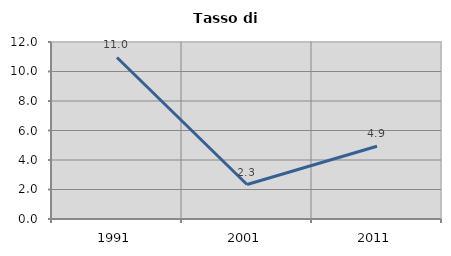
| Category | Tasso di disoccupazione   |
|---|---|
| 1991.0 | 10.952 |
| 2001.0 | 2.338 |
| 2011.0 | 4.936 |